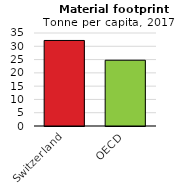
| Category | Material footprint (tonne/capita) |
|---|---|
| Switzerland | 32.192 |
| OECD | 24.755 |